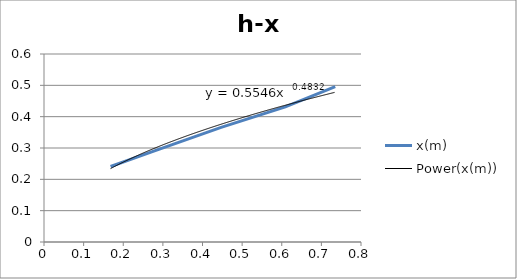
| Category | x(m) |
|---|---|
| 0.168 | 0.241 |
| 0.27 | 0.287 |
| 0.447 | 0.366 |
| 0.609 | 0.431 |
| 0.735 | 0.496 |